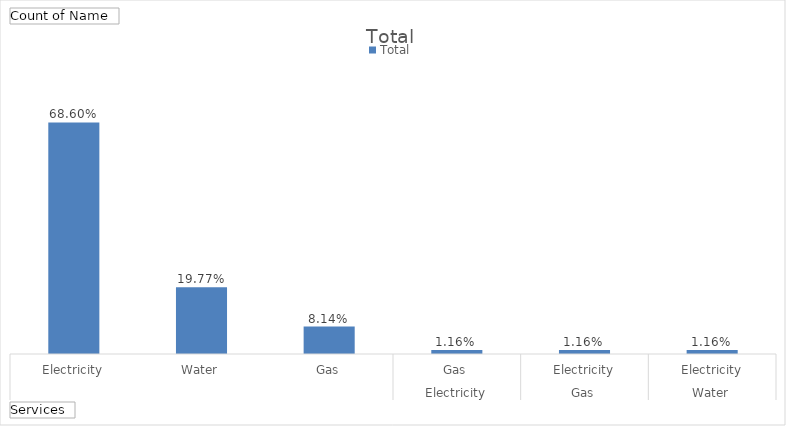
| Category | Total |
|---|---|
| Electricity | 0.686 |
| Water | 0.198 |
| Gas | 0.081 |
| Gas
Electricity | 0.012 |
| Electricity
Gas | 0.012 |
| Electricity
Water | 0.012 |